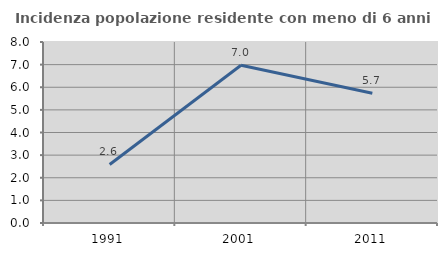
| Category | Incidenza popolazione residente con meno di 6 anni |
|---|---|
| 1991.0 | 2.586 |
| 2001.0 | 6.972 |
| 2011.0 | 5.736 |